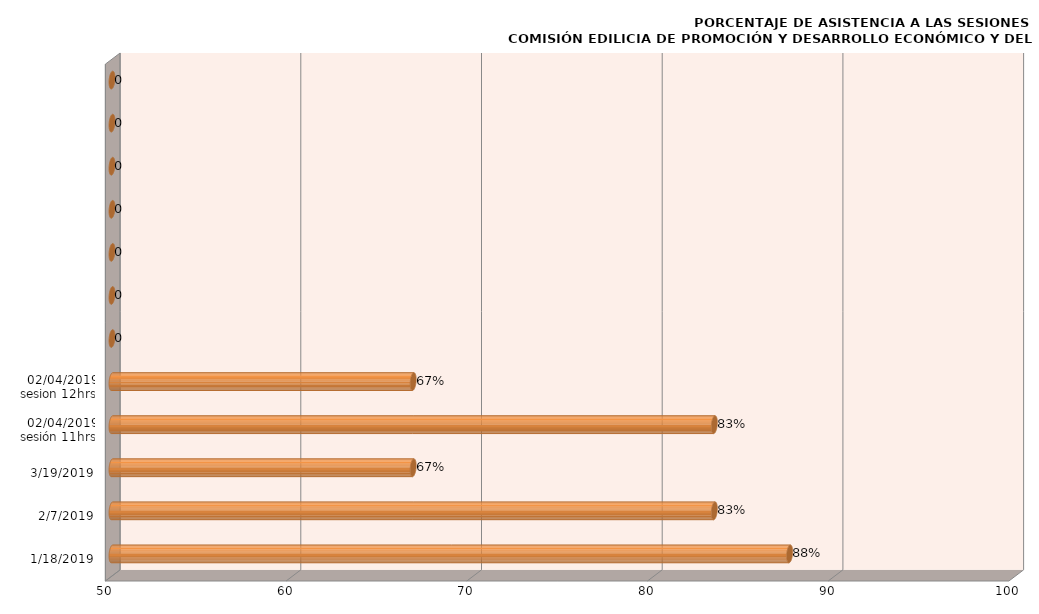
| Category | Series 0 |
|---|---|
| 18/01/2019 | 87.5 |
| 07/02/2019 | 83.333 |
| 19/03/2019 | 66.667 |
| 02/04/2019
sesión 11hrs | 83.333 |
| 02/04/2019
sesion 12hrs | 66.667 |